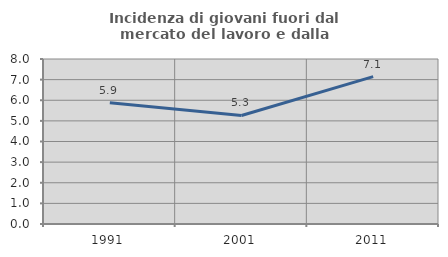
| Category | Incidenza di giovani fuori dal mercato del lavoro e dalla formazione  |
|---|---|
| 1991.0 | 5.882 |
| 2001.0 | 5.263 |
| 2011.0 | 7.143 |